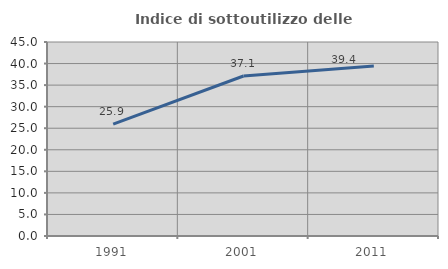
| Category | Indice di sottoutilizzo delle abitazioni  |
|---|---|
| 1991.0 | 25.935 |
| 2001.0 | 37.109 |
| 2011.0 | 39.414 |